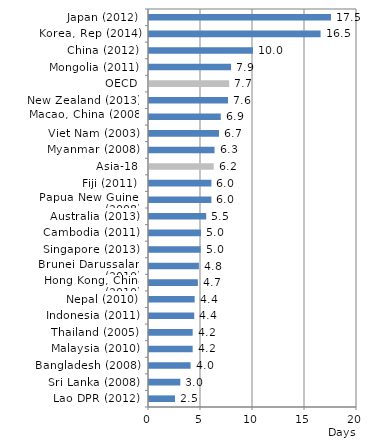
| Category | Series 0 |
|---|---|
| Lao DPR (2012) | 2.5 |
| Sri Lanka (2008) | 3.01 |
| Bangladesh (2008) | 4 |
| Malaysia (2010) | 4.2 |
| Thailand (2005) | 4.2 |
| Indonesia (2011) | 4.35 |
| Nepal (2010) | 4.39 |
| Hong Kong, China (2010) | 4.7 |
| Brunei Darussalam (2010) | 4.8 |
| Singapore (2013) | 4.97 |
| Cambodia (2011) | 5 |
| Australia (2013) | 5.5 |
| Papua New Guinea (2008) | 6 |
| Fiji (2011) | 6 |
| Asia-18 | 6.224 |
| Myanmar (2008) | 6.3 |
| Viet Nam (2003) | 6.73 |
| Macao, China (2008) | 6.9 |
| New Zealand (2013) | 7.6 |
| OECD | 7.71 |
| Mongolia (2011) | 7.89 |
| China (2012) | 10 |
| Korea, Rep (2014) | 16.5 |
| Japan (2012) | 17.5 |